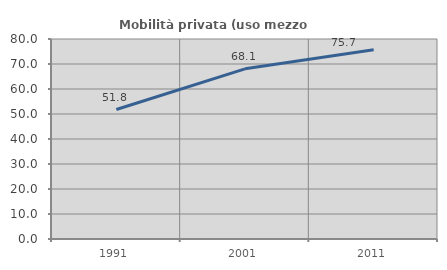
| Category | Mobilità privata (uso mezzo privato) |
|---|---|
| 1991.0 | 51.778 |
| 2001.0 | 68.066 |
| 2011.0 | 75.735 |